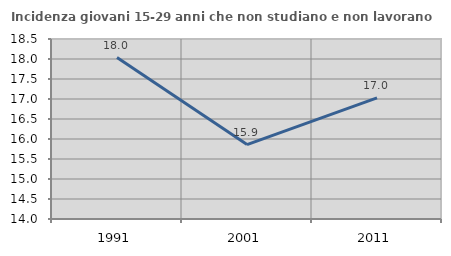
| Category | Incidenza giovani 15-29 anni che non studiano e non lavorano  |
|---|---|
| 1991.0 | 18.035 |
| 2001.0 | 15.861 |
| 2011.0 | 17.027 |